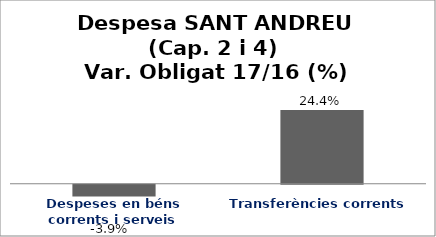
| Category | Series 0 |
|---|---|
| Despeses en béns corrents i serveis | -0.039 |
| Transferències corrents | 0.244 |